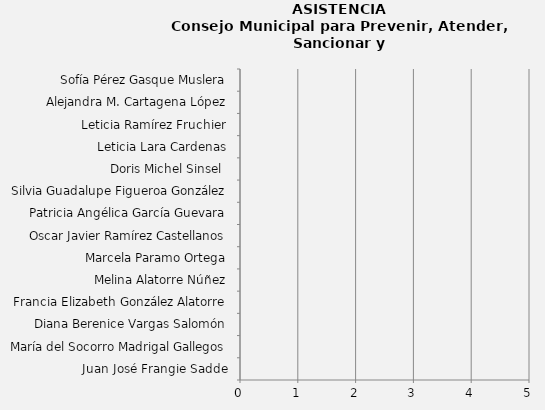
| Category | Juan José Frangie Sadde |
|---|---|
| Juan José Frangie Sadde | 0 |
| María del Socorro Madrigal Gallegos | 0 |
| Diana Berenice Vargas Salomón | 0 |
| Francia Elizabeth González Alatorre | 0 |
| Melina Alatorre Núñez | 0 |
| Marcela Paramo Ortega | 0 |
| Oscar Javier Ramírez Castellanos | 0 |
| Patricia Angélica García Guevara | 0 |
| Silvia Guadalupe Figueroa González | 0 |
| Doris Michel Sinsel  | 0 |
| Leticia Lara Cardenas | 0 |
| Leticia Ramírez Fruchier | 0 |
| Alejandra M. Cartagena López | 0 |
| Sofía Pérez Gasque Muslera | 0 |